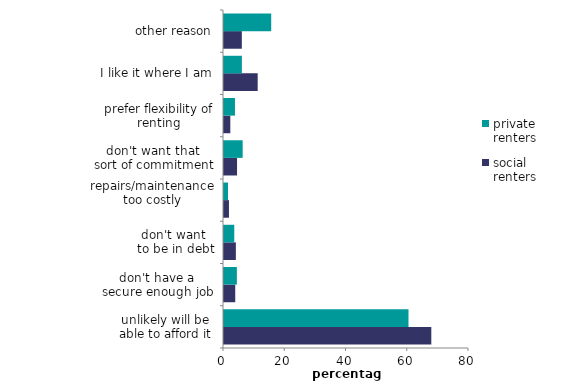
| Category | social renters | private renters |
|---|---|---|
| unlikely will be
able to afford it | 67.692 | 60.246 |
| don't have a 
secure enough job | 3.67 | 4.202 |
| don't want 
to be in debt | 3.872 | 3.353 |
| repairs/maintenance
too costly | 1.619 | 1.298 |
| don't want that 
sort of commitment | 4.258 | 6.1 |
| prefer flexibility of renting | 2.06 | 3.578 |
| I like it where I am | 11.002 | 5.835 |
| other reason | 5.824 | 15.414 |